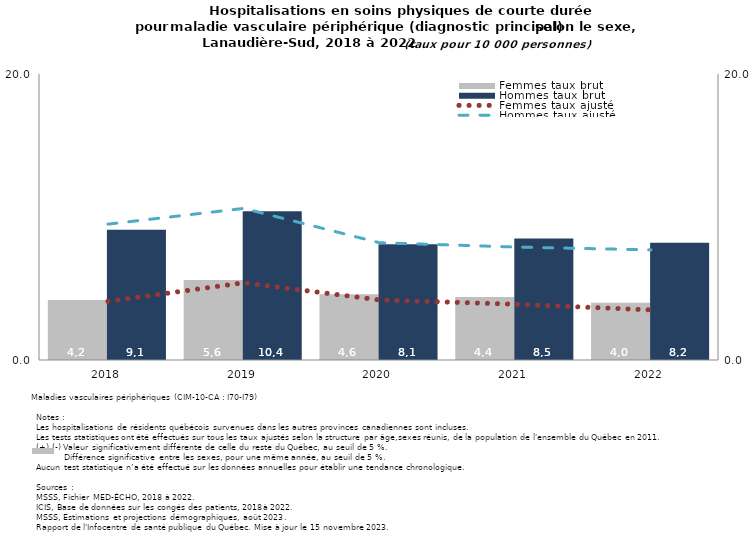
| Category | Femmes taux brut | Hommes taux brut |
|---|---|---|
| 2018.0 | 4.2 | 9.1 |
| 2019.0 | 5.6 | 10.4 |
| 2020.0 | 4.6 | 8.1 |
| 2021.0 | 4.4 | 8.5 |
| 2022.0 | 4 | 8.2 |